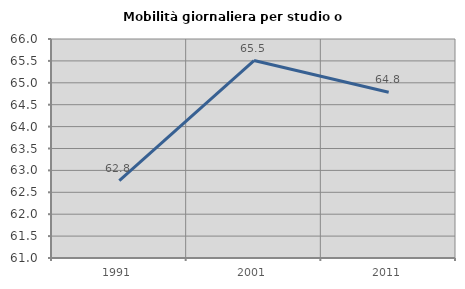
| Category | Mobilità giornaliera per studio o lavoro |
|---|---|
| 1991.0 | 62.767 |
| 2001.0 | 65.509 |
| 2011.0 | 64.783 |